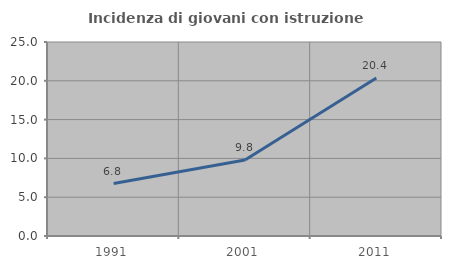
| Category | Incidenza di giovani con istruzione universitaria |
|---|---|
| 1991.0 | 6.757 |
| 2001.0 | 9.783 |
| 2011.0 | 20.37 |